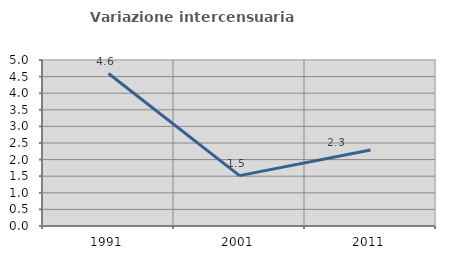
| Category | Variazione intercensuaria annua |
|---|---|
| 1991.0 | 4.593 |
| 2001.0 | 1.518 |
| 2011.0 | 2.29 |